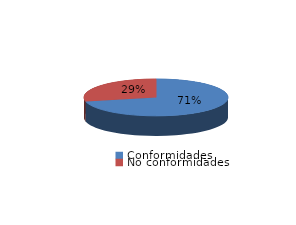
| Category | Series 0 |
|---|---|
| Conformidades | 4871 |
| No conformidades | 1949 |